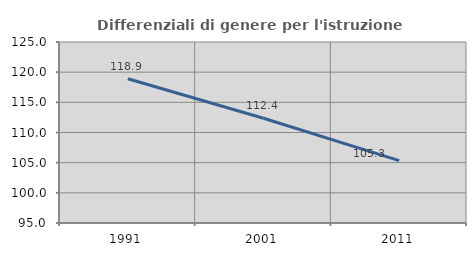
| Category | Differenziali di genere per l'istruzione superiore |
|---|---|
| 1991.0 | 118.916 |
| 2001.0 | 112.364 |
| 2011.0 | 105.347 |